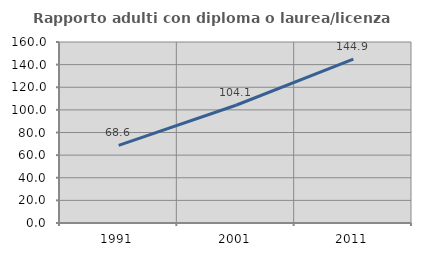
| Category | Rapporto adulti con diploma o laurea/licenza media  |
|---|---|
| 1991.0 | 68.615 |
| 2001.0 | 104.095 |
| 2011.0 | 144.858 |